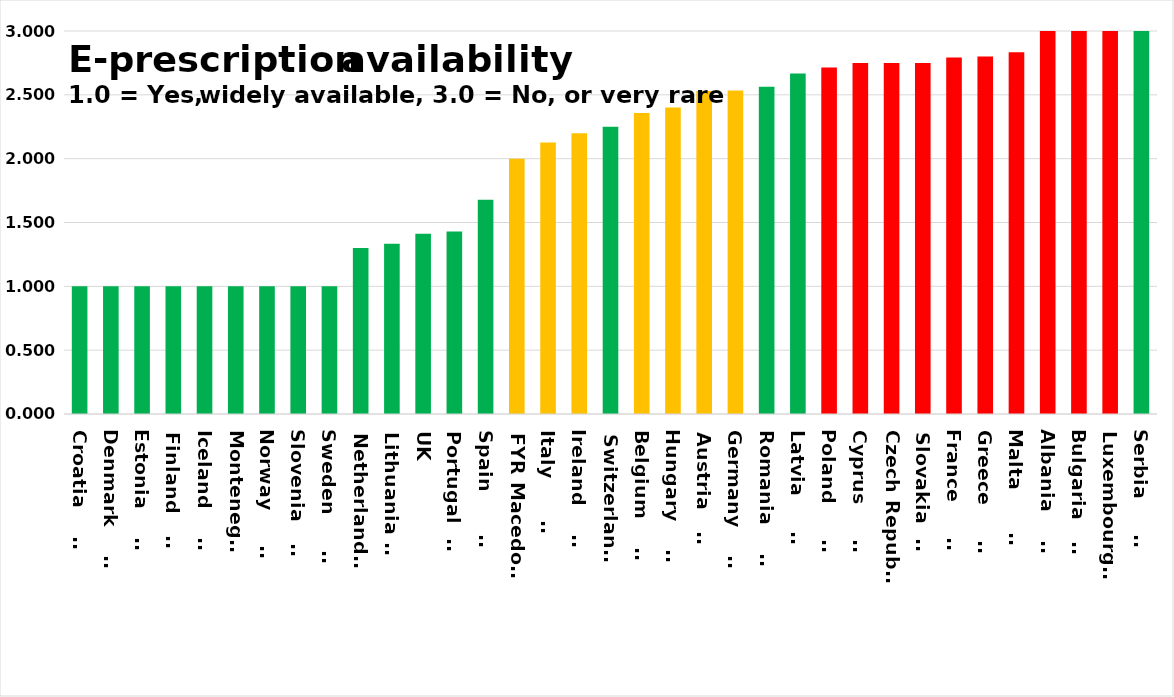
| Category | Series 0 |
|---|---|
| Croatia        | 1 |
| Denmark        | 1 |
| Estonia        | 1 |
| Finland        | 1 |
| Iceland        | 1 |
| Montenegro | 1 |
| Norway         | 1 |
| Slovenia       | 1 |
| Sweden         | 1 |
| Netherlands    | 1.3 |
| Lithuania      | 1.333 |
| UK | 1.412 |
| Portugal       | 1.429 |
| Spain          | 1.679 |
| FYR Macedonia | 2 |
| Italy          | 2.127 |
| Ireland        | 2.2 |
| Switzerland    | 2.25 |
| Belgium        | 2.357 |
| Hungary        | 2.4 |
| Austria        | 2.529 |
| Germany        | 2.533 |
| Romania        | 2.562 |
| Latvia         | 2.667 |
| Poland         | 2.714 |
| Cyprus         | 2.75 |
| Czech Republic | 2.75 |
| Slovakia       | 2.75 |
| France         | 2.793 |
| Greece         | 2.8 |
| Malta          | 2.833 |
| Albania        | 3 |
| Bulgaria       | 3 |
| Luxembourg     | 3 |
| Serbia         | 3 |